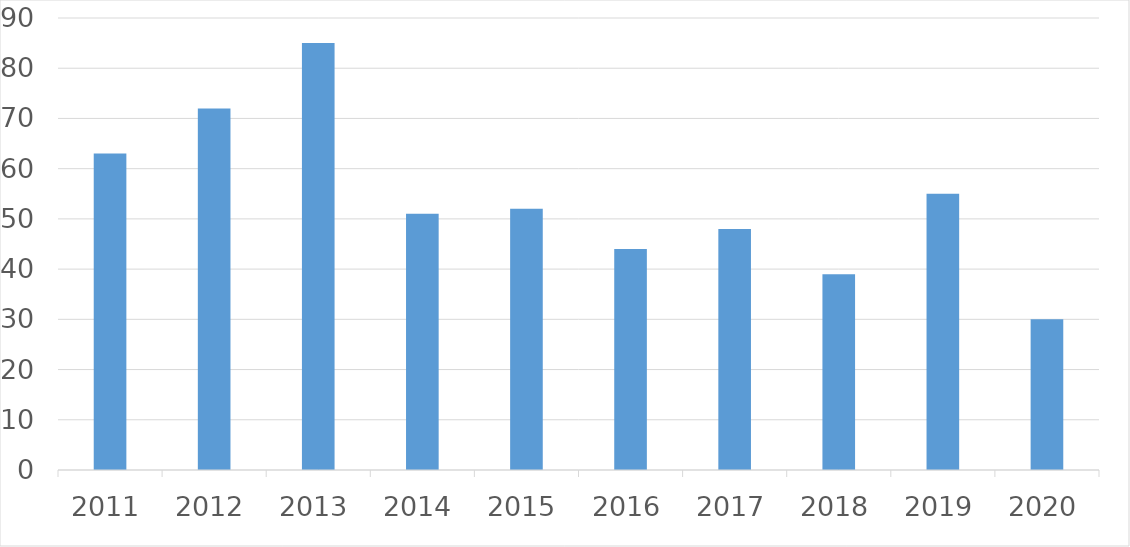
| Category | Series 0 |
|---|---|
| 2011 | 63 |
| 2012 | 72 |
| 2013 | 85 |
| 2014 | 51 |
| 2015 | 52 |
| 2016 | 44 |
| 2017 | 48 |
| 2018 | 39 |
| 2019 | 55 |
| 2020 | 30 |